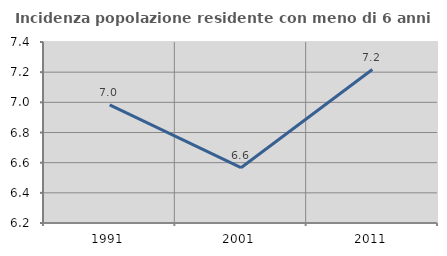
| Category | Incidenza popolazione residente con meno di 6 anni |
|---|---|
| 1991.0 | 6.983 |
| 2001.0 | 6.566 |
| 2011.0 | 7.217 |